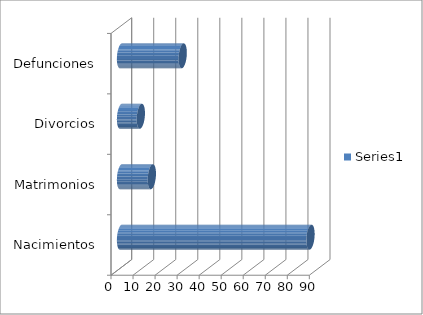
| Category | Series 0 |
|---|---|
| Nacimientos | 86 |
| Matrimonios | 14 |
| Divorcios | 9 |
| Defunciones | 28 |